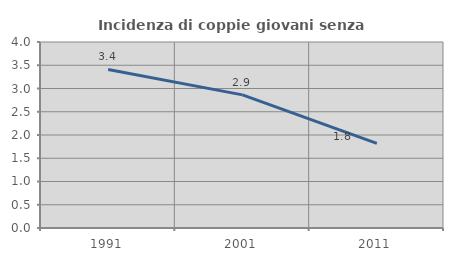
| Category | Incidenza di coppie giovani senza figli |
|---|---|
| 1991.0 | 3.409 |
| 2001.0 | 2.862 |
| 2011.0 | 1.821 |